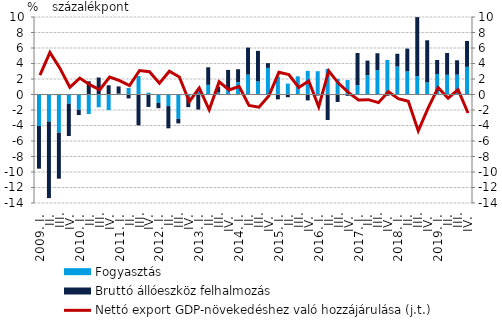
| Category | Fogyasztás | Bruttó állóeszköz felhalmozás |
|---|---|---|
| 2009. I. | -4.06 | -5.511 |
|          II. | -3.49 | -9.88 |
|          III. | -4.919 | -5.94 |
|          IV. | -1.186 | -4.173 |
| 2010. I. | -1.971 | -0.676 |
|          II. | -2.524 | 1.704 |
|          III. | -1.65 | 2.194 |
|          IV. | -2.013 | 1.19 |
| 2011. I. | 0.117 | 0.923 |
|          II. | 0.835 | -0.501 |
|          III. | 2.392 | -3.979 |
|          IV. | 0.234 | -1.602 |
| 2012. I. | -1.1 | -0.667 |
|          II. | -1.494 | -2.869 |
|          III. | -3.135 | -0.591 |
|          IV. | -0.362 | -1.27 |
| 2013. I. | 0.692 | -1.943 |
| II. | 1.247 | 2.266 |
|          III. | 0.319 | 0.693 |
| IV. | 0.633 | 2.542 |
| 2014. I. | 1.591 | 1.668 |
| II. | 2.567 | 3.485 |
|          III. | 1.689 | 3.939 |
| IV. | 3.437 | 0.607 |
| 2015. I. | 2.298 | -0.627 |
| II. | 1.41 | -0.353 |
|          III. | 2.348 | -0.007 |
| IV. | 3.055 | -0.759 |
| 2016. I. | 3.003 | -0.134 |
| II. | 3.303 | -3.294 |
|          III. | 2.004 | -0.962 |
| IV. | 1.861 | -0.17 |
| 2017. I. | 1.215 | 4.143 |
| II. | 2.495 | 1.881 |
|          III. | 3.149 | 2.172 |
| IV. | 4.457 | -0.162 |
| 2018. I. | 3.605 | 1.652 |
| II. | 2.993 | 2.931 |
|          III. | 2.376 | 7.608 |
| IV. | 1.556 | 5.441 |
| 2019. I. | 2.641 | 1.816 |
| II. | 2.543 | 2.813 |
|          III. | 2.559 | 1.856 |
| IV. | 3.574 | 3.335 |